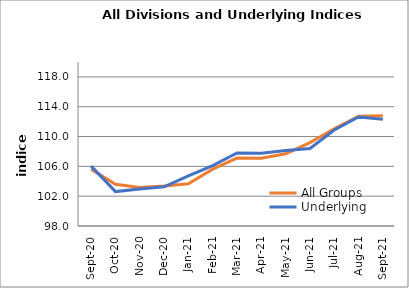
| Category | All Groups | Underlying |
|---|---|---|
| 2020-09-01 | 105.614 | 106.027 |
| 2020-10-01 | 103.588 | 102.619 |
| 2020-11-01 | 103.171 | 102.969 |
| 2020-12-01 | 103.378 | 103.266 |
| 2021-01-01 | 103.671 | 104.733 |
| 2021-02-01 | 105.627 | 106.099 |
| 2021-03-01 | 107.11 | 107.788 |
| 2021-04-01 | 107.082 | 107.772 |
| 2021-05-01 | 107.693 | 108.128 |
| 2021-06-01 | 109.193 | 108.399 |
| 2021-07-01 | 111.039 | 110.883 |
| 2021-08-01 | 112.735 | 112.633 |
| 2021-09-01 | 112.778 | 112.306 |